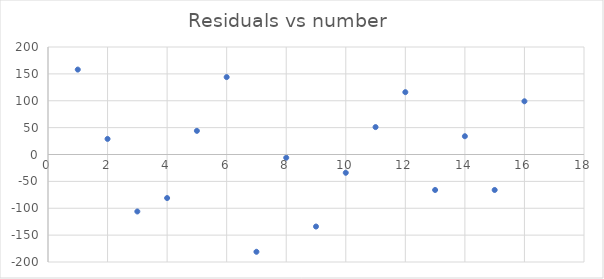
| Category | Series 0 |
|---|---|
| 1.0 | 158 |
| 2.0 | 29 |
| 3.0 | -106 |
| 4.0 | -81 |
| 5.0 | 44 |
| 6.0 | 144 |
| 7.0 | -181 |
| 8.0 | -6 |
| 9.0 | -134 |
| 10.0 | -34 |
| 11.0 | 51 |
| 12.0 | 116 |
| 13.0 | -66 |
| 14.0 | 34 |
| 15.0 | -66 |
| 16.0 | 99 |